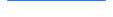
| Category | Series 0 |
|---|---|
| 0 | 552 |
| 1 | 576 |
| 2 | 485 |
| 3 | 463 |
| 4 | 474 |
| 5 | 473 |
| 6 | 493 |
| 7 | 418 |
| 8 | 444 |